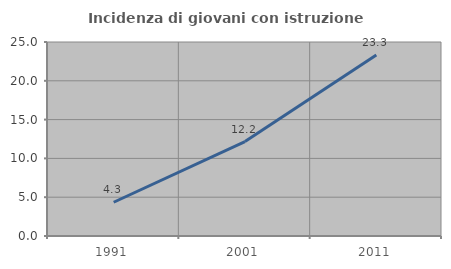
| Category | Incidenza di giovani con istruzione universitaria |
|---|---|
| 1991.0 | 4.348 |
| 2001.0 | 12.174 |
| 2011.0 | 23.333 |